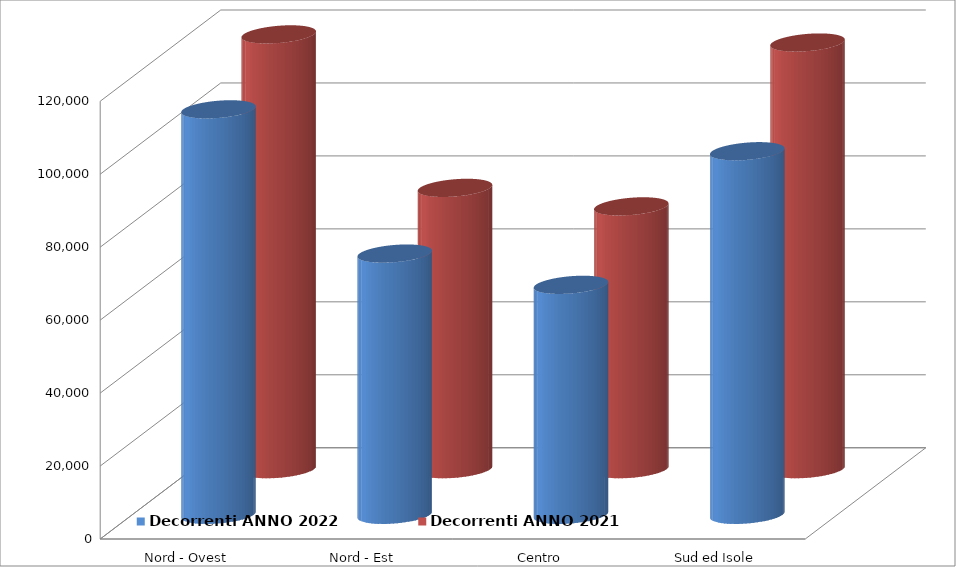
| Category | Decorrenti ANNO 2022 | Decorrenti ANNO 2021 |
|---|---|---|
| Nord - Ovest | 111149 | 119190 |
| Nord - Est | 71614 | 77118 |
| Centro | 63044 | 72047 |
| Sud ed Isole | 99668 | 116961 |